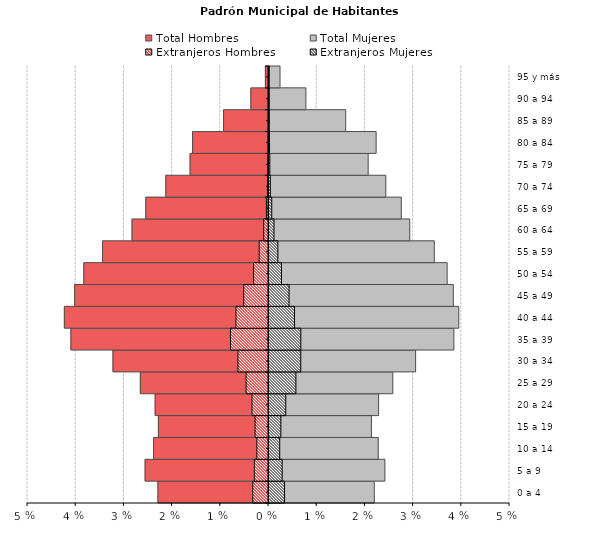
| Category | Total Hombres | Total Mujeres | Extranjeros Hombres | Extranjeros Mujeres |
|---|---|---|---|---|
| 0 a 4 | -0.023 | 0.022 | -0.003 | 0.003 |
| 5 a 9 | -0.026 | 0.024 | -0.003 | 0.003 |
| 10 a 14 | -0.024 | 0.023 | -0.002 | 0.002 |
| 15 a 19 | -0.023 | 0.021 | -0.003 | 0.002 |
| 20 a 24 | -0.024 | 0.023 | -0.003 | 0.003 |
| 25 a 29 | -0.027 | 0.026 | -0.005 | 0.006 |
| 30 a 34 | -0.032 | 0.03 | -0.006 | 0.007 |
| 35 a 39 | -0.041 | 0.038 | -0.008 | 0.007 |
| 40 a 44 | -0.042 | 0.039 | -0.007 | 0.005 |
| 45 a 49 | -0.04 | 0.038 | -0.005 | 0.004 |
| 50 a 54 | -0.038 | 0.037 | -0.003 | 0.003 |
| 55 a 59 | -0.034 | 0.034 | -0.002 | 0.002 |
| 60 a 64 | -0.028 | 0.029 | -0.001 | 0.001 |
| 65 a 69 | -0.025 | 0.027 | 0 | 0.001 |
| 70 a 74 | -0.021 | 0.024 | 0 | 0 |
| 75 a 79 | -0.016 | 0.021 | 0 | 0 |
| 80 a 84 | -0.016 | 0.022 | 0 | 0 |
| 85 a 89 | -0.009 | 0.016 | 0 | 0 |
| 90 a 94 | -0.004 | 0.008 | 0 | 0 |
| 95 y más | -0.001 | 0.002 | 0 | 0 |